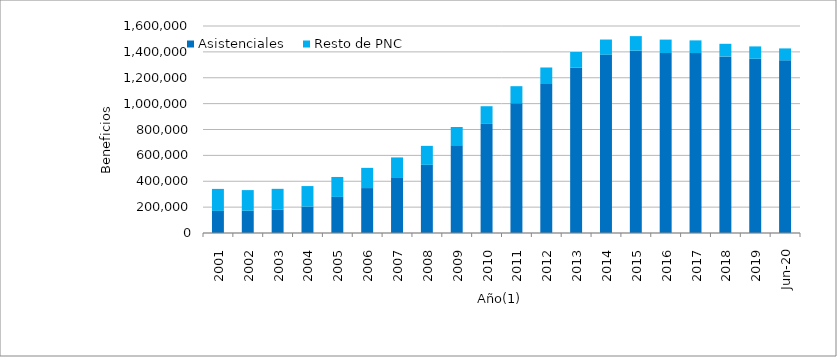
| Category | Asistenciales | Resto de PNC |
|---|---|---|
| 2001.0 | 170688 | 170159 |
| 2002.0 | 171790 | 159761 |
| 2003.0 | 179462 | 161912 |
| 2004.0 | 204383 | 158322 |
| 2005.0 | 278885 | 154252 |
| 2006.0 | 347223 | 156271 |
| 2007.0 | 430747 | 153352 |
| 2008.0 | 526978 | 146565 |
| 2009.0 | 678684 | 140652 |
| 2010.0 | 843222 | 136730 |
| 2011.0 | 1002631 | 132117 |
| 2012.0 | 1151713 | 127630 |
| 2013.0 | 1277482 | 121704 |
| 2014.0 | 1378747 | 116623 |
| 2015.0 | 1409012 | 112673 |
| 2016.0 | 1390872 | 104039 |
| 2017.0 | 1390560 | 98299 |
| 2018.0 | 1365207 | 97199 |
| 2019.0 | 1346815 | 95436 |
| 43983.0 | 1334429 | 92338 |